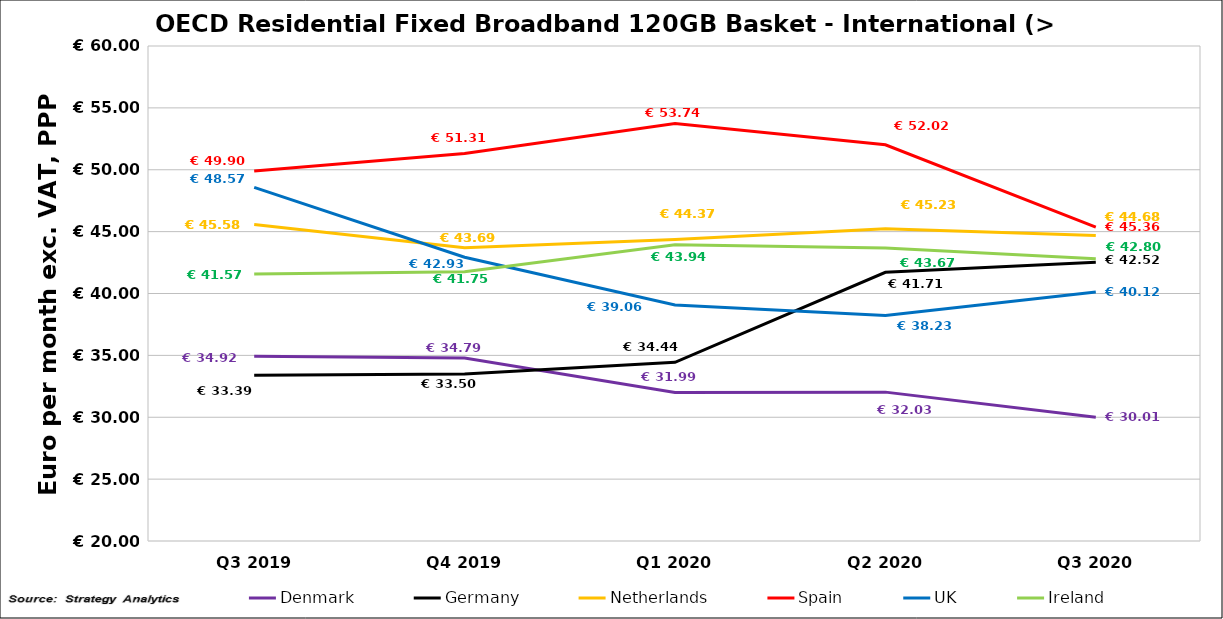
| Category | Denmark | Germany | Netherlands | Spain | UK | Ireland |
|---|---|---|---|---|---|---|
| Q3 2019 | 34.92 | 33.387 | 45.579 | 49.901 | 48.572 | 41.569 |
| Q4 2019 | 34.79 | 33.5 | 43.69 | 51.31 | 42.93 | 41.75 |
| Q1 2020 | 31.995 | 34.437 | 44.372 | 53.736 | 39.064 | 43.943 |
| Q2 2020 | 32.03 | 41.71 | 45.23 | 52.02 | 38.23 | 43.67 |
| Q3 2020 | 30.008 | 42.521 | 44.678 | 45.364 | 40.117 | 42.805 |